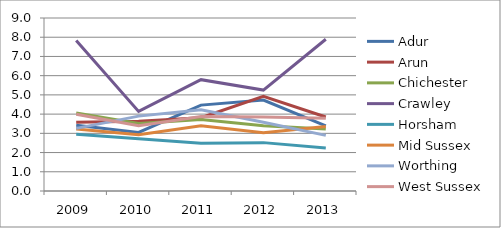
| Category | Adur | Arun | Chichester | Crawley | Horsham | Mid Sussex | Worthing | West Sussex |
|---|---|---|---|---|---|---|---|---|
| 2009.0 | 3.424 | 3.571 | 4.053 | 7.828 | 2.95 | 3.224 | 3.257 | 3.989 |
| 2010.0 | 3.049 | 3.625 | 3.509 | 4.138 | 2.722 | 2.925 | 3.895 | 3.4 |
| 2011.0 | 4.467 | 3.811 | 3.719 | 5.792 | 2.478 | 3.388 | 4.229 | 3.874 |
| 2012.0 | 4.728 | 4.926 | 3.395 | 5.25 | 2.516 | 3.032 | 3.581 | 3.843 |
| 2013.0 | 3.391 | 3.852 | 3.219 | 7.893 | 2.235 | 3.353 | 2.895 | 3.789 |